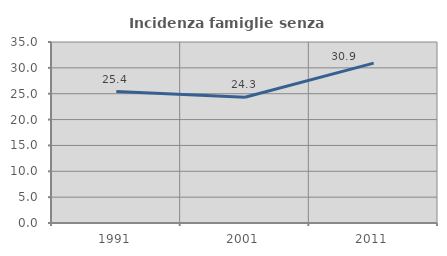
| Category | Incidenza famiglie senza nuclei |
|---|---|
| 1991.0 | 25.406 |
| 2001.0 | 24.313 |
| 2011.0 | 30.916 |